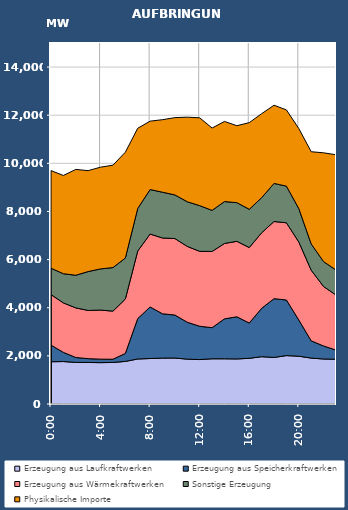
| Category | Erzeugung aus Laufkraftwerken | Erzeugung aus Speicherkraftwerken | Erzeugung aus Wärmekraftwerken | Sonstige Erzeugung | Physikalische Importe |
|---|---|---|---|---|---|
| 2007-01-17 | 1755.943 | 692.113 | 2098.427 | 1095.183 | 4055.982 |
| 2007-01-17 01:00:00 | 1764.291 | 380.636 | 2056.409 | 1212.558 | 4082.074 |
| 2007-01-17 02:00:00 | 1727.471 | 205.206 | 2061.665 | 1354.917 | 4397.674 |
| 2007-01-17 03:00:00 | 1725.682 | 159.515 | 2002.128 | 1615.989 | 4193.458 |
| 2007-01-17 04:00:00 | 1717.997 | 145.656 | 2039.971 | 1709.067 | 4228.238 |
| 2007-01-17 05:00:00 | 1726.406 | 133.319 | 1999.2 | 1810.714 | 4254.546 |
| 2007-01-17 06:00:00 | 1769.246 | 332.243 | 2259.007 | 1702.917 | 4399.874 |
| 2007-01-17 07:00:00 | 1869.954 | 1680.978 | 2806.868 | 1767.906 | 3333.314 |
| 2007-01-17 08:00:00 | 1889.36 | 2141.946 | 3031.473 | 1848.565 | 2841.606 |
| 2007-01-17 09:00:00 | 1905.669 | 1841.98 | 3150.114 | 1902.43 | 3013.714 |
| 2007-01-17 10:00:00 | 1910.658 | 1785.228 | 3178.817 | 1812.238 | 3211.714 |
| 2007-01-17 11:00:00 | 1863.231 | 1533.425 | 3150.848 | 1855.874 | 3515.106 |
| 2007-01-17 12:00:00 | 1846.991 | 1383.171 | 3113.168 | 1898.648 | 3649.47 |
| 2007-01-17 13:00:00 | 1878.612 | 1292.402 | 3167.073 | 1707.22 | 3420.561 |
| 2007-01-17 14:00:00 | 1878.381 | 1659.526 | 3132.021 | 1741.08 | 3330.371 |
| 2007-01-17 15:00:00 | 1871.888 | 1751.955 | 3136.591 | 1605.513 | 3197.45 |
| 2007-01-17 16:00:00 | 1898.016 | 1466.021 | 3137.047 | 1589.96 | 3599.594 |
| 2007-01-17 17:00:00 | 1965.059 | 2010.327 | 3140.222 | 1456.718 | 3490.546 |
| 2007-01-17 18:00:00 | 1935.158 | 2441.84 | 3206.422 | 1581.454 | 3248.846 |
| 2007-01-17 19:00:00 | 2011.151 | 2310.385 | 3208.689 | 1522.432 | 3167.206 |
| 2007-01-17 20:00:00 | 1985.929 | 1502.81 | 3243.791 | 1386.937 | 3324.014 |
| 2007-01-17 21:00:00 | 1907.593 | 716.858 | 2935.797 | 1090.457 | 3831.418 |
| 2007-01-17 22:00:00 | 1869.27 | 540.787 | 2470.828 | 1034.026 | 4521.778 |
| 2007-01-17 23:00:00 | 1859.633 | 380.472 | 2288.393 | 1039.37 | 4788.87 |